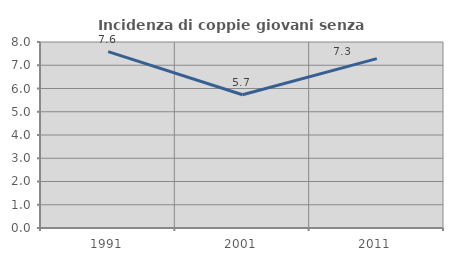
| Category | Incidenza di coppie giovani senza figli |
|---|---|
| 1991.0 | 7.586 |
| 2001.0 | 5.732 |
| 2011.0 | 7.285 |